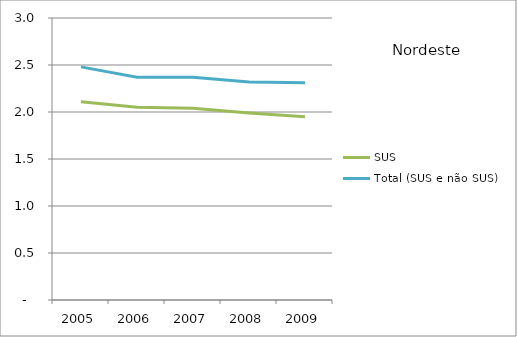
| Category | SUS | Total (SUS e não SUS) |
|---|---|---|
| 2005.0 | 2.11 | 2.48 |
| 2006.0 | 2.05 | 2.37 |
| 2007.0 | 2.04 | 2.37 |
| 2008.0 | 1.99 | 2.32 |
| 2009.0 | 1.95 | 2.31 |